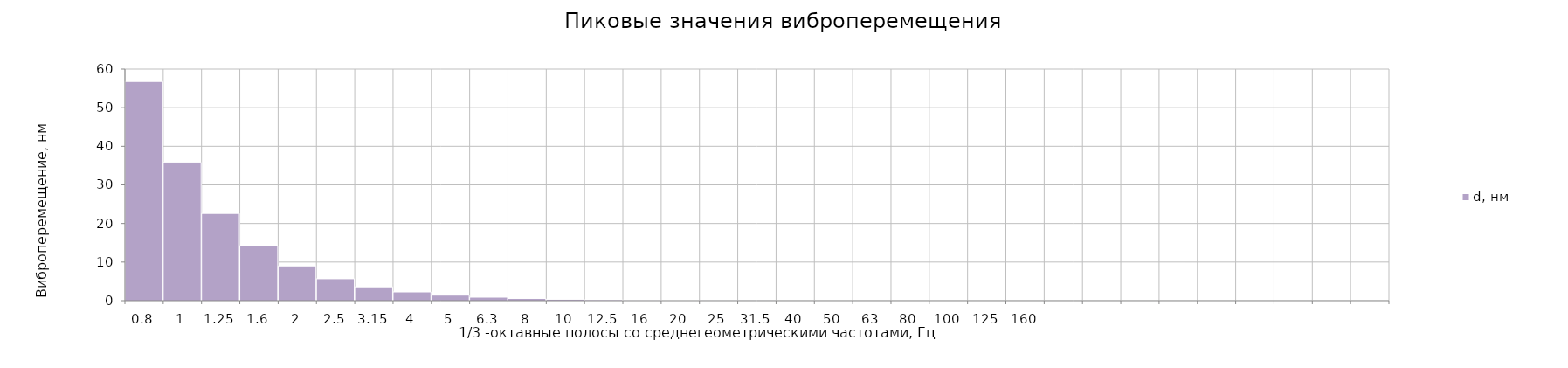
| Category | d, нм |
|---|---|
| 0.8 | 56.783 |
| 1.0 | 35.825 |
| 1.25 | 22.605 |
| 1.6 | 14.262 |
| 2.0 | 8.998 |
| 2.5 | 5.678 |
| 3.15 | 3.582 |
| 4.0 | 2.26 |
| 5.0 | 1.426 |
| 6.3 | 0.9 |
| 8.0 | 0.568 |
| 10.0 | 0.358 |
| 12.5 | 0.226 |
| 16.0 | 0.143 |
| 20.0 | 0.09 |
| 25.0 | 0.057 |
| 31.5 | 0.036 |
| 40.0 | 0.023 |
| 50.0 | 0.014 |
| 63.0 | 0.009 |
| 80.0 | 0.006 |
| 100.0 | 0.004 |
| 125.0 | 0.002 |
| 160.0 | 0.001 |